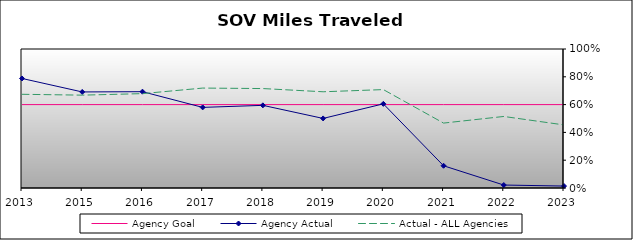
| Category | Agency Goal | Agency Actual | Actual - ALL Agencies |
|---|---|---|---|
| 2013.0 | 0.6 | 0.788 | 0.674 |
| 2015.0 | 0.6 | 0.691 | 0.668 |
| 2016.0 | 0.6 | 0.693 | 0.679 |
| 2017.0 | 0.6 | 0.58 | 0.719 |
| 2018.0 | 0.6 | 0.595 | 0.715 |
| 2019.0 | 0.6 | 0.5 | 0.692 |
| 2020.0 | 0.6 | 0.605 | 0.708 |
| 2021.0 | 0.6 | 0.16 | 0.467 |
| 2022.0 | 0.6 | 0.021 | 0.515 |
| 2023.0 | 0.6 | 0.014 | 0.454 |